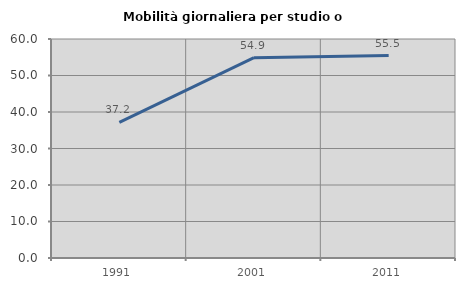
| Category | Mobilità giornaliera per studio o lavoro |
|---|---|
| 1991.0 | 37.152 |
| 2001.0 | 54.88 |
| 2011.0 | 55.466 |